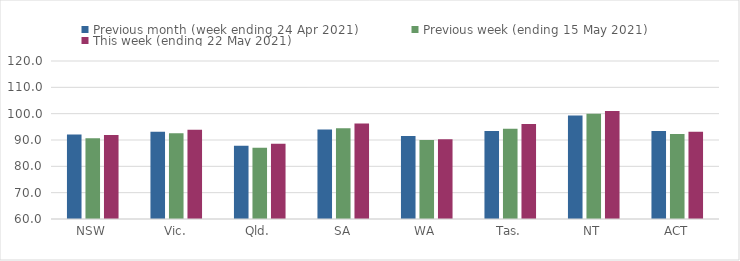
| Category | Previous month (week ending 24 Apr 2021) | Previous week (ending 15 May 2021) | This week (ending 22 May 2021) |
|---|---|---|---|
| NSW | 92.1 | 90.67 | 91.86 |
| Vic. | 93.15 | 92.6 | 93.85 |
| Qld. | 87.78 | 87.1 | 88.62 |
| SA | 93.97 | 94.44 | 96.25 |
| WA | 91.55 | 90 | 90.26 |
| Tas. | 93.4 | 94.26 | 96.04 |
| NT | 99.34 | 100 | 100.98 |
| ACT | 93.45 | 92.28 | 93.13 |